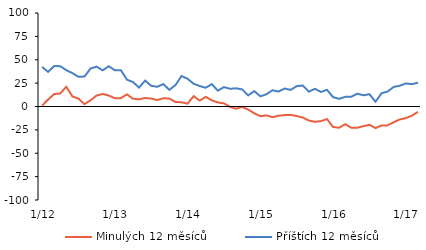
| Category | Minulých 12 měsíců | Příštích 12 měsíců |
|---|---|---|
|  1/12 | 0.85 | 42.3 |
|  2/12 | 7.49 | 37.02 |
|  3/12 | 13.29 | 43.26 |
|  4/12 | 13.96 | 43.14 |
|  5/12 | 21.08 | 38.87 |
|  6/12 | 10.81 | 35.74 |
|  7/12 | 8.46 | 31.81 |
|  8/12 | 2.55 | 32.03 |
|  9/12 | 6.58 | 40.6 |
|  10/12 | 11.79 | 42.65 |
|  11/12 | 13.41 | 38.66 |
|  12/12 | 11.71 | 43.07 |
|  1/13 | 8.92 | 38.82 |
|  2/13 | 8.92 | 38.82 |
|  3/13 | 12.98 | 28.75 |
|  4/13 | 8.4 | 26.12 |
|  5/13 | 7.64 | 20.26 |
|  6/13 | 9.1 | 27.71 |
|  7/13 | 8.51 | 22.2 |
|  8/13 | 6.89 | 21.06 |
|  9/13 | 8.81 | 23.95 |
|  10/13 | 8.54 | 17.76 |
|  11/13 | 4.88 | 22.87 |
|  12/13 | 4.53 | 32.62 |
|  1/14 | 2.99 | 29.64 |
|  2/14 | 11.1 | 24.37 |
|  3/14 | 6.35 | 21.86 |
|  4/14 | 10.34 | 20.09 |
|  5/14 | 6.57 | 23.91 |
|  6/14 | 4.33 | 16.91 |
|  7/14 | 3.35 | 20.75 |
|  8/14 | -0.33 | 18.95 |
|  9/14 | -2.37 | 19.44 |
|  10/14 | -0.5 | 18.32 |
|  11/14 | -3.3 | 11.85 |
|  12/14 | -7.21 | 16.46 |
|  1/15 | -10.32 | 10.88 |
|  2/15 | -9.55 | 13.1 |
|  3/15 | -11.45 | 17.32 |
|  4/15 | -9.85 | 16.04 |
|  5/15 | -9.22 | 19.19 |
|  6/15 | -8.99 | 17.77 |
|  7/15 | -10.2 | 21.74 |
|  8/15 | -11.76 | 22.49 |
|  9/15 | -15.03 | 15.86 |
|  10/15 | -16.38 | 18.89 |
|  11/15 | -15.64 | 15.55 |
|  12/15 | -13.49 | 17.84 |
|  1/16 | -21.91 | 10.03 |
|  2/16 | -22.72 | 8.16 |
|  3/16 | -18.91 | 10.34 |
|  4/16 | -22.65 | 10.48 |
|  5/16 | -22.69 | 13.73 |
|  6/16 | -21.05 | 11.99 |
|  7/16 | -19.56 | 13.15 |
|  8/16 | -23.1 | 5.15 |
|  9/16 | -20.21 | 14.17 |
|  10/16 | -20.19 | 16 |
|  11/16 | -16.81 | 20.99 |
|  12/16 | -13.84 | 22.19 |
|  1/17 | -12.4 | 24.7 |
|  2/17 | -9.79 | 23.87 |
|  3/17 | -5.67 | 25.48 |